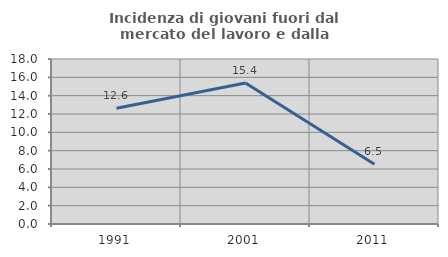
| Category | Incidenza di giovani fuori dal mercato del lavoro e dalla formazione  |
|---|---|
| 1991.0 | 12.621 |
| 2001.0 | 15.385 |
| 2011.0 | 6.522 |